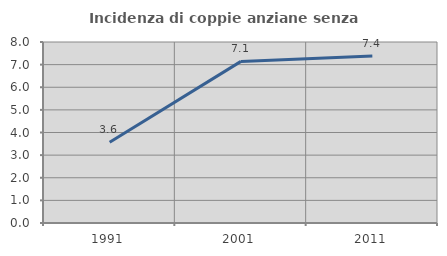
| Category | Incidenza di coppie anziane senza figli  |
|---|---|
| 1991.0 | 3.571 |
| 2001.0 | 7.143 |
| 2011.0 | 7.386 |